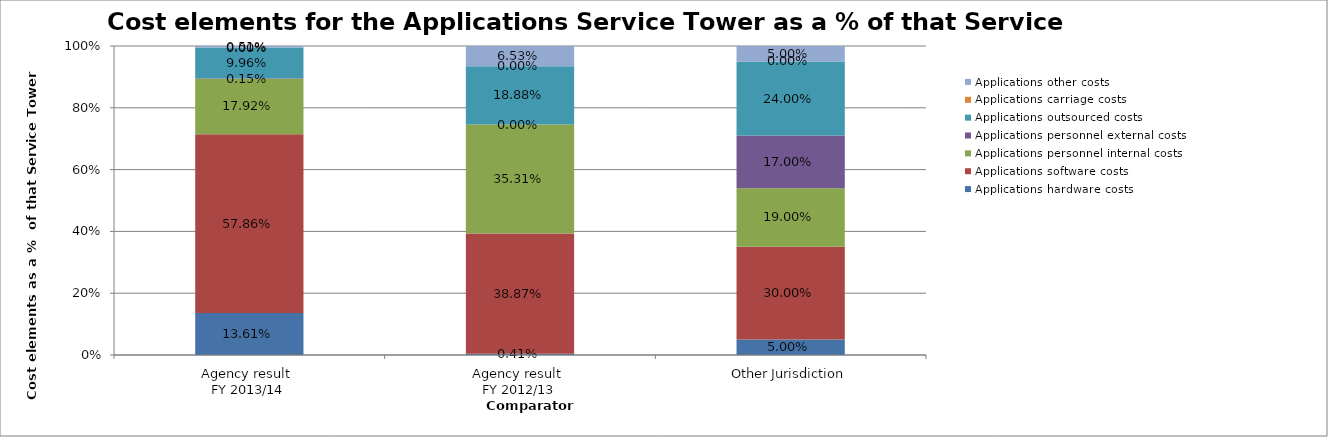
| Category | Applications hardware costs | Applications software costs | Applications personnel internal costs | Applications personnel external costs | Applications outsourced costs | Applications carriage costs | Applications other costs |
|---|---|---|---|---|---|---|---|
| Agency result 
FY 2013/14 | 0.136 | 0.579 | 0.179 | 0.002 | 0.1 | 0 | 0.005 |
| Agency result 
FY 2012/13 | 0.004 | 0.389 | 0.353 | 0 | 0.189 | 0 | 0.065 |
| Other Jurisdiction | 0.05 | 0.3 | 0.19 | 0.17 | 0.24 | 0 | 0.05 |